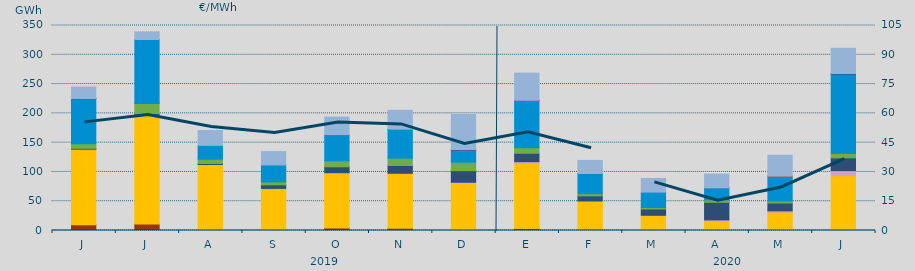
| Category | Carbón | Ciclo Combinado | Cogeneración | Consumo Bombeo | Eólica | Hidráulica | Nuclear | Otras Renovables | Solar fotovoltaica | Turbinación bombeo |
|---|---|---|---|---|---|---|---|---|---|---|
| J | 9630 | 128693.8 | 467.1 | 1487.8 | 7835.7 | 76799.4 | 366 | 20 | 0 | 19680.5 |
| J | 11017.4 | 186524.2 | 300.4 | 1392.5 | 17639.5 | 109155.5 | 60 | 0 | 0 | 13153.1 |
| A | 1459.4 | 111215 | 0 | 1733.4 | 7402.2 | 23588.2 | 0 | 0 | 0 | 25429.5 |
| S | 311.6 | 71523.4 | 0 | 6112.7 | 5081.7 | 28895.9 | 0 | 0 | 0 | 22840.2 |
| O | 4163.7 | 94511.7 | 0 | 10093.2 | 10069.8 | 45049.8 | 0 | 0 | 0 | 29699 |
| N | 3677.8 | 93991.4 | 51.5 | 13298.4 | 12383 | 48971.8 | 539 | 0 | 0 | 32260 |
| D | 1607.3 | 80390.7 | 371.4 | 19733.1 | 14568.3 | 20541.3 | 876.4 | 0 | 1.2 | 60128.2 |
| E | 3376.2 | 112471.6 | 1718.3 | 14293.3 | 9539.1 | 80742.1 | 186 | 0 | 0 | 46371.3 |
| F | 1995 | 48257.3 | 169 | 8732.4 | 3606.8 | 34283.3 | 267 | 0 | 0 | 22347.8 |
| M | 418.1 | 25069.8 | 511.6 | 10680.8 | 2598.7 | 26299.3 | 0 | 0 | 0 | 23301.1 |
| A | 0 | 17020 | 1099 | 30032 | 4029 | 20482 | 12 | 0 | 0 | 23437 |
| M | 5 | 31454.1 | 2074.9 | 13342 | 3540.5 | 42478.4 | 139 | 0 | 1 | 35473.1 |
| J | 105 | 93533.6 | 8541.6 | 21857.1 | 7292.6 | 135598.7 | 1073 | 0 | 2 | 43074.4 |